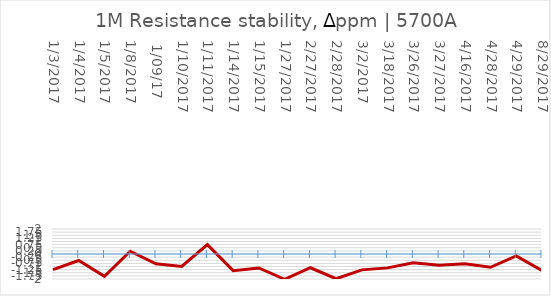
| Category | Series 0 |
|---|---|
| 1/3/2017 | -1.25 |
| 1/4/2017 | -0.52 |
| 1/5/2017 | -1.78 |
| 1/8/2017 | 0.22 |
|  1/09/17 | -0.78 |
| 1/10/2017 | -1 |
| 1/11/2017 | 0.75 |
| 1/14/2017 | -1.33 |
| 1/15/2017 | -1.12 |
| 1/27/2017 | -2.02 |
| 2/27/2017 | -1.1 |
| 2/28/2017 | -1.98 |
| 3/2/2017 | -1.27 |
| 3/18/2017 | -1.11 |
| 3/26/2017 | -0.71 |
| 3/27/2017 | -0.9 |
| 4/16/2017 | -0.78 |
| 4/28/2017 | -1.06 |
| 4/29/2017 | -0.15 |
| 8/29/2017 | -1.33 |